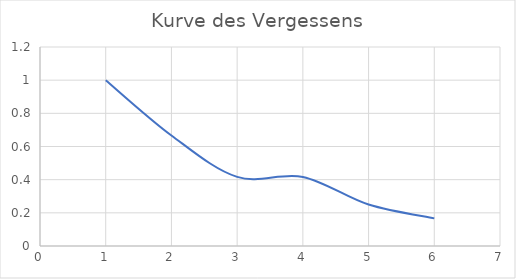
| Category | Series 0 |
|---|---|
| 0 | 1 |
| 1 | 0.667 |
| 2 | 0.417 |
| 3 | 0.417 |
| 4 | 0.25 |
| 5 | 0.167 |